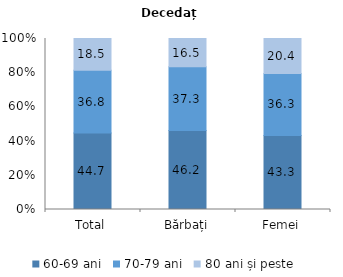
| Category | 60-69 ani | 70-79 ani | 80 ani și peste |
|---|---|---|---|
| Total | 44.7 | 36.8 | 18.5 |
| Bărbați | 46.2 | 37.3 | 16.5 |
| Femei | 43.3 | 36.3 | 20.4 |